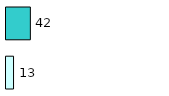
| Category | Series 0 | Series 1 |
|---|---|---|
| 0 | 13 | 42 |